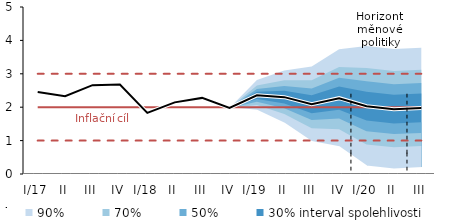
| Category | Inflation Target | Inflation Target - lower bound | Inflation Target - upper bound | linka | Střed předpovědi |
|---|---|---|---|---|---|
| I/17 | 2 | 1 | 3 | 2.455 | 2.455 |
| II | 2 | 1 | 3 | 2.327 | 2.327 |
| III | 2 | 1 | 3 | 2.66 | 2.66 |
| IV | 2 | 1 | 3 | 2.677 | 2.677 |
| I/18 | 2 | 1 | 3 | 1.831 | 1.831 |
| II | 2 | 1 | 3 | 2.145 | 2.145 |
| III | 2 | 1 | 3 | 2.279 | 2.279 |
| IV | 2 | 1 | 3 | 1.979 | 1.979 |
| I/19 | 2 | 1 | 3 | 2.355 | 2.355 |
| II | 2 | 1 | 3 | 2.301 | 2.301 |
| III | 2 | 1 | 3 | 2.089 | 2.089 |
| IV | 2 | 1 | 3 | 2.27 | 2.27 |
| I/20 | 2 | 1 | 3 | 2.031 | 2.031 |
| II | 2 | 1 | 3 | 1.942 | 1.942 |
| III | 2 | 1 | 3 | 1.979 | 1.979 |